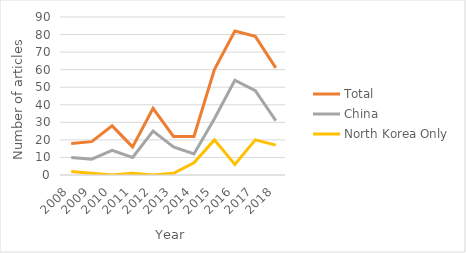
| Category | Total | China | North Korea Only |
|---|---|---|---|
| 2008.0 | 18 | 10 | 2 |
| 2009.0 | 19 | 9 | 1 |
| 2010.0 | 28 | 14 | 0 |
| 2011.0 | 16 | 10 | 1 |
| 2012.0 | 38 | 25 | 0 |
| 2013.0 | 22 | 16 | 1 |
| 2014.0 | 22 | 12 | 7 |
| 2015.0 | 60 | 32 | 20 |
| 2016.0 | 82 | 54 | 6 |
| 2017.0 | 79 | 48 | 20 |
| 2018.0 | 61 | 31 | 17 |